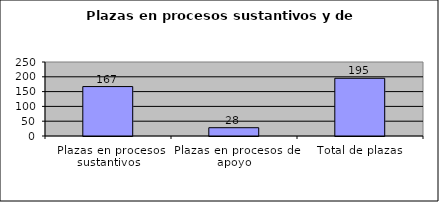
| Category | Series 0 |
|---|---|
| Plazas en procesos sustantivos | 167 |
| Plazas en procesos de apoyo | 28 |
| Total de plazas | 195 |